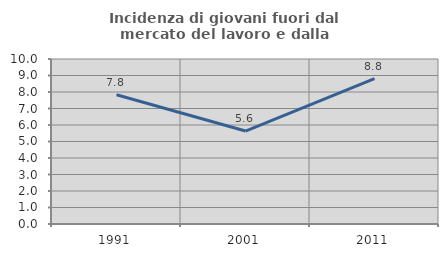
| Category | Incidenza di giovani fuori dal mercato del lavoro e dalla formazione  |
|---|---|
| 1991.0 | 7.831 |
| 2001.0 | 5.634 |
| 2011.0 | 8.805 |